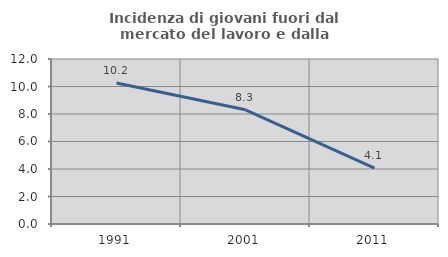
| Category | Incidenza di giovani fuori dal mercato del lavoro e dalla formazione  |
|---|---|
| 1991.0 | 10.249 |
| 2001.0 | 8.303 |
| 2011.0 | 4.065 |